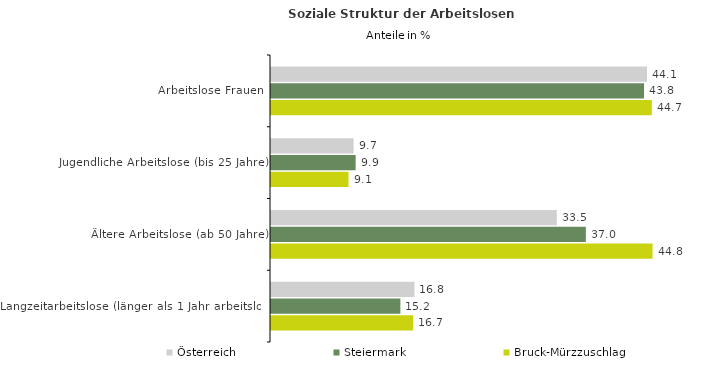
| Category | Österreich | Steiermark | Bruck-Mürzzuschlag |
|---|---|---|---|
| Arbeitslose Frauen | 44.136 | 43.785 | 44.696 |
| Jugendliche Arbeitslose (bis 25 Jahre) | 9.698 | 9.935 | 9.099 |
| Ältere Arbeitslose (ab 50 Jahre) | 33.548 | 36.954 | 44.785 |
| Langzeitarbeitslose (länger als 1 Jahr arbeitslos) | 16.836 | 15.186 | 16.689 |